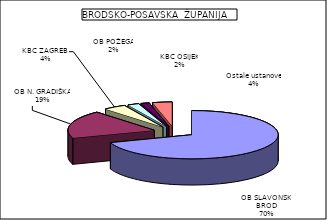
| Category | Series 0 |
|---|---|
| OB SLAVONSKI BROD | 69.676 |
| OB N. GRADIŠKA | 18.746 |
| KBC ZAGREB  | 4.22 |
| OB POŽEGA | 2.112 |
| KBC OSIJEK | 1.573 |
| Ostale ustanove | 3.673 |